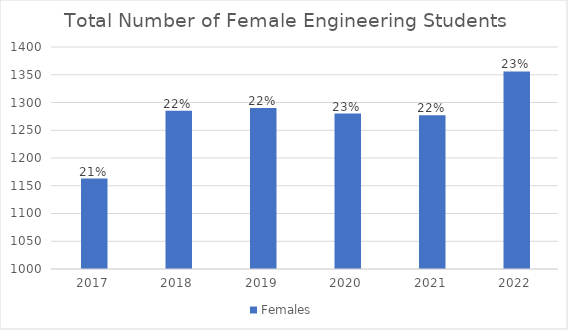
| Category | Females |
|---|---|
| 2017.0 | 1163 |
| 2018.0 | 1285 |
| 2019.0 | 1290 |
| 2020.0 | 1280 |
| 2021.0 | 1277 |
| 2022.0 | 1356 |